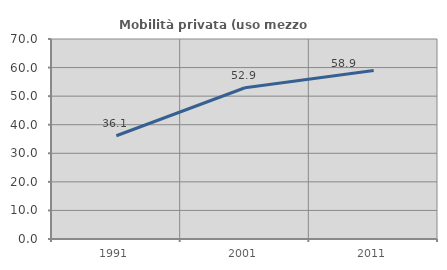
| Category | Mobilità privata (uso mezzo privato) |
|---|---|
| 1991.0 | 36.141 |
| 2001.0 | 52.934 |
| 2011.0 | 58.942 |